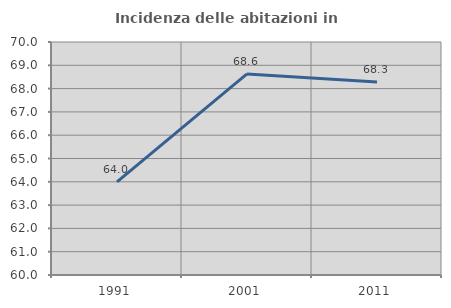
| Category | Incidenza delle abitazioni in proprietà  |
|---|---|
| 1991.0 | 63.994 |
| 2001.0 | 68.632 |
| 2011.0 | 68.283 |